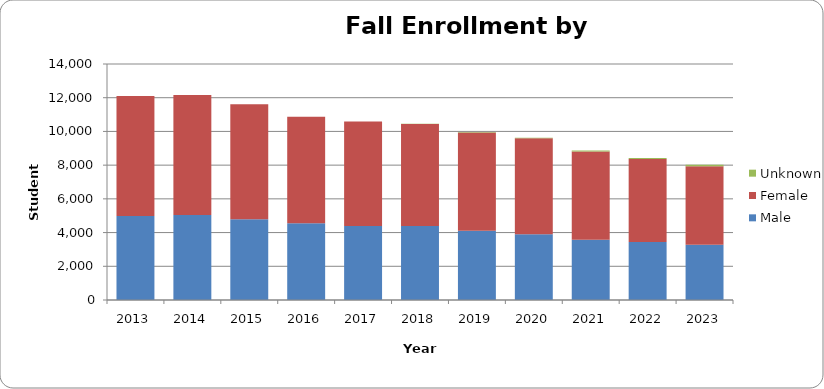
| Category | Male | Female | Unknown |
|---|---|---|---|
| 2013.0 | 4990 | 7118 | 0 |
| 2014.0 | 5040 | 7121 | 0 |
| 2015.0 | 4790 | 6822 | 0 |
| 2016.0 | 4552 | 6320 | 0 |
| 2017.0 | 4396 | 6193 | 1 |
| 2018.0 | 4385 | 6054 | 22 |
| 2019.0 | 4115 | 5826 | 20 |
| 2020.0 | 3896 | 5692 | 42 |
| 2021.0 | 3580 | 5227 | 59 |
| 2022.0 | 3444 | 4920 | 64 |
| 2023.0 | 3282 | 4658 | 83 |